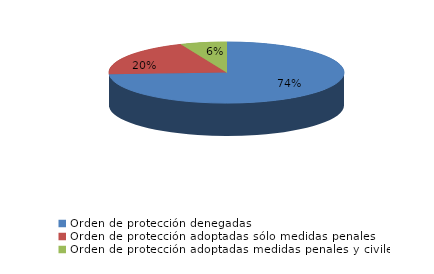
| Category | Series 0 |
|---|---|
| Orden de protección denegadas | 129 |
| Orden de protección adoptadas sólo medidas penales | 34 |
| Orden de protección adoptadas medidas penales y civiles | 11 |